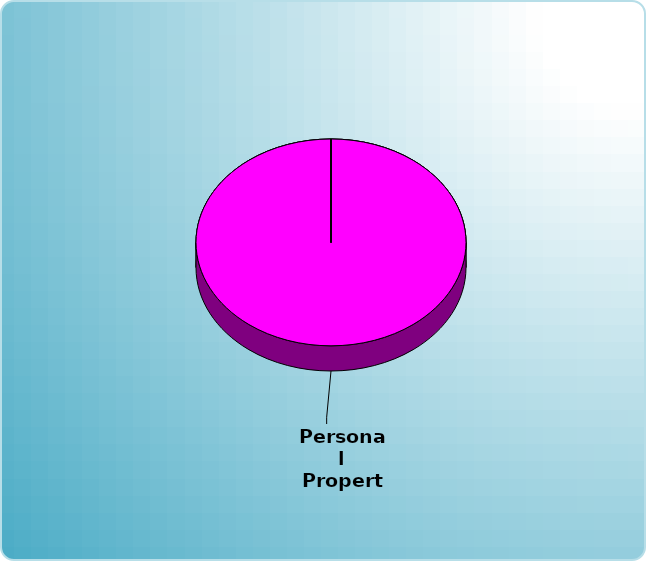
| Category | Series 0 |
|---|---|
| Cash | 0 |
| Bonds | 0 |
| Muni Bond | 0 |
| Hybrid bond | 0 |
| Value | 0 |
| Growth | 0 |
| Small-Cap | 0 |
| Tangibles | 0 |
| International | 0 |
| Personal Property | 400000 |
| Miscellaneous | 0 |